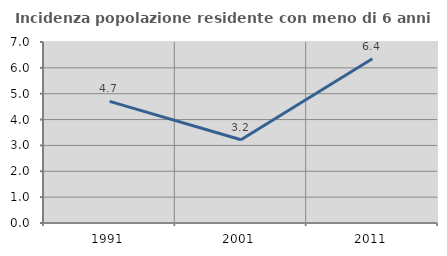
| Category | Incidenza popolazione residente con meno di 6 anni |
|---|---|
| 1991.0 | 4.703 |
| 2001.0 | 3.218 |
| 2011.0 | 6.353 |